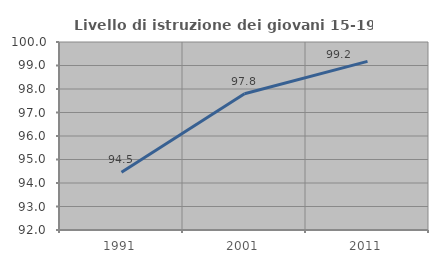
| Category | Livello di istruzione dei giovani 15-19 anni |
|---|---|
| 1991.0 | 94.454 |
| 2001.0 | 97.798 |
| 2011.0 | 99.175 |